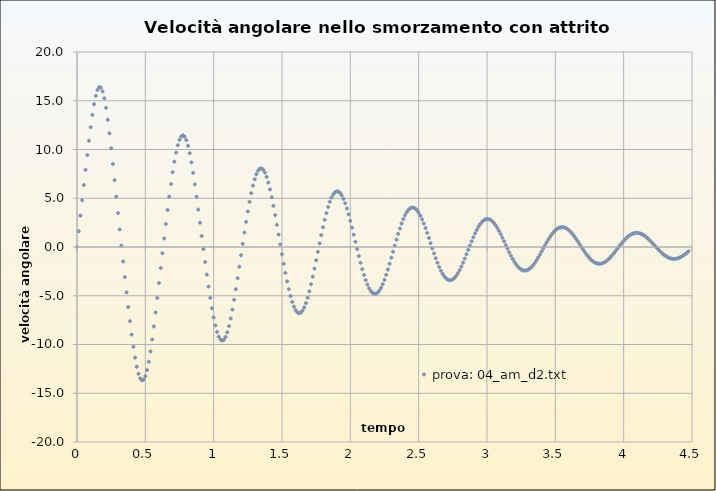
| Category | prova: 04_am_d2.txt |
|---|---|
| 0.0 | 0 |
| 0.012499999999999956 | 1.613 |
| 0.02499999999999991 | 3.207 |
| 0.03749999999999987 | 4.789 |
| 0.04999999999999982 | 6.357 |
| 0.0625 | 7.909 |
| 0.07499999999999996 | 9.43 |
| 0.08749999999999991 | 10.9 |
| 0.09999999999999987 | 12.287 |
| 0.11249999999999982 | 13.55 |
| 0.125 | 14.64 |
| 0.13749999999999996 | 15.508 |
| 0.1499999999999999 | 16.104 |
| 0.16249999999999987 | 16.389 |
| 0.17499999999999982 | 16.341 |
| 0.1875 | 15.957 |
| 0.19999999999999996 | 15.256 |
| 0.2124999999999999 | 14.273 |
| 0.22499999999999987 | 13.056 |
| 0.23749999999999982 | 11.657 |
| 0.25 | 10.127 |
| 0.26249999999999996 | 8.512 |
| 0.2749999999999999 | 6.848 |
| 0.2875000000000001 | 5.163 |
| 0.2999999999999998 | 3.476 |
| 0.3125 | 1.801 |
| 0.32499999999999973 | 0.145 |
| 0.3374999999999999 | -1.485 |
| 0.3500000000000001 | -3.085 |
| 0.3624999999999998 | -4.647 |
| 0.375 | -6.162 |
| 0.38749999999999973 | -7.613 |
| 0.3999999999999999 | -8.979 |
| 0.4125000000000001 | -10.235 |
| 0.4249999999999998 | -11.347 |
| 0.4375 | -12.28 |
| 0.44999999999999973 | -12.999 |
| 0.4624999999999999 | -13.472 |
| 0.4750000000000001 | -13.676 |
| 0.4874999999999998 | -13.598 |
| 0.5 | -13.242 |
| 0.5124999999999997 | -12.622 |
| 0.5249999999999999 | -11.766 |
| 0.5375000000000001 | -10.709 |
| 0.5499999999999998 | -9.489 |
| 0.5625 | -8.145 |
| 0.5749999999999997 | -6.713 |
| 0.5874999999999999 | -5.223 |
| 0.6000000000000001 | -3.701 |
| 0.6124999999999998 | -2.166 |
| 0.625 | -0.637 |
| 0.6374999999999997 | 0.875 |
| 0.6499999999999999 | 2.355 |
| 0.6625000000000001 | 3.792 |
| 0.6749999999999998 | 5.168 |
| 0.6875 | 6.468 |
| 0.6999999999999997 | 7.67 |
| 0.7124999999999999 | 8.751 |
| 0.7250000000000001 | 9.683 |
| 0.7374999999999998 | 10.442 |
| 0.75 | 11.002 |
| 0.7624999999999997 | 11.342 |
| 0.7749999999999999 | 11.451 |
| 0.7875000000000001 | 11.323 |
| 0.7999999999999998 | 10.964 |
| 0.8125 | 10.388 |
| 0.8249999999999997 | 9.617 |
| 0.8374999999999999 | 8.679 |
| 0.8500000000000001 | 7.603 |
| 0.8624999999999998 | 6.419 |
| 0.875 | 5.156 |
| 0.8874999999999997 | 3.84 |
| 0.8999999999999999 | 2.493 |
| 0.9125000000000001 | 1.136 |
| 0.9249999999999998 | -0.214 |
| 0.9375 | -1.541 |
| 0.9499999999999997 | -2.828 |
| 0.9624999999999999 | -4.059 |
| 0.9750000000000001 | -5.215 |
| 0.9874999999999998 | -6.279 |
| 1.0 | -7.229 |
| 1.0124999999999997 | -8.045 |
| 1.025 | -8.707 |
| 1.0375 | -9.197 |
| 1.0499999999999998 | -9.499 |
| 1.0625 | -9.605 |
| 1.0749999999999997 | -9.513 |
| 1.0875 | -9.226 |
| 1.1 | -8.755 |
| 1.1124999999999998 | -8.116 |
| 1.125 | -7.331 |
| 1.1374999999999997 | -6.423 |
| 1.15 | -5.415 |
| 1.1625 | -4.331 |
| 1.1749999999999998 | -3.195 |
| 1.1875 | -2.028 |
| 1.1999999999999997 | -0.848 |
| 1.2125 | 0.327 |
| 1.225 | 1.478 |
| 1.2374999999999998 | 2.589 |
| 1.25 | 3.643 |
| 1.2624999999999997 | 4.624 |
| 1.275 | 5.514 |
| 1.2875 | 6.295 |
| 1.2999999999999998 | 6.951 |
| 1.3125 | 7.466 |
| 1.3249999999999997 | 7.829 |
| 1.3375 | 8.029 |
| 1.35 | 8.062 |
| 1.3624999999999998 | 7.928 |
| 1.375 | 7.634 |
| 1.3874999999999997 | 7.188 |
| 1.4 | 6.605 |
| 1.4125 | 5.903 |
| 1.4249999999999998 | 5.1 |
| 1.4375 | 4.216 |
| 1.4499999999999997 | 3.271 |
| 1.4625 | 2.284 |
| 1.475 | 1.274 |
| 1.4874999999999998 | 0.259 |
| 1.5 | -0.745 |
| 1.5124999999999997 | -1.72 |
| 1.525 | -2.652 |
| 1.5375 | -3.525 |
| 1.5499999999999998 | -4.322 |
| 1.5625 | -5.029 |
| 1.5749999999999997 | -5.633 |
| 1.5875 | -6.119 |
| 1.6 | -6.478 |
| 1.6124999999999998 | -6.702 |
| 1.625 | -6.785 |
| 1.6374999999999997 | -6.728 |
| 1.65 | -6.533 |
| 1.6625 | -6.206 |
| 1.6749999999999998 | -5.759 |
| 1.6875 | -5.204 |
| 1.6999999999999997 | -4.555 |
| 1.7125 | -3.829 |
| 1.725 | -3.043 |
| 1.7374999999999998 | -2.213 |
| 1.75 | -1.356 |
| 1.7624999999999997 | -0.489 |
| 1.775 | 0.374 |
| 1.7875 | 1.217 |
| 1.7999999999999998 | 2.025 |
| 1.8125 | 2.784 |
| 1.8249999999999997 | 3.48 |
| 1.8375 | 4.101 |
| 1.85 | 4.634 |
| 1.8624999999999998 | 5.068 |
| 1.875 | 5.396 |
| 1.8874999999999997 | 5.609 |
| 1.9 | 5.705 |
| 1.9125 | 5.682 |
| 1.9249999999999998 | 5.542 |
| 1.9375 | 5.29 |
| 1.9499999999999997 | 4.934 |
| 1.9625 | 4.484 |
| 1.975 | 3.951 |
| 1.9874999999999998 | 3.349 |
| 2.0 | 2.691 |
| 2.0124999999999997 | 1.993 |
| 2.025 | 1.267 |
| 2.0375 | 0.53 |
| 2.05 | -0.206 |
| 2.0625 | -0.927 |
| 2.0749999999999997 | -1.619 |
| 2.0875 | -2.27 |
| 2.1 | -2.868 |
| 2.1125 | -3.401 |
| 2.125 | -3.861 |
| 2.1374999999999997 | -4.236 |
| 2.15 | -4.521 |
| 2.1625 | -4.71 |
| 2.175 | -4.8 |
| 2.1875 | -4.789 |
| 2.1999999999999997 | -4.68 |
| 2.2125 | -4.476 |
| 2.225 | -4.184 |
| 2.2375 | -3.81 |
| 2.25 | -3.366 |
| 2.2624999999999997 | -2.862 |
| 2.275 | -2.309 |
| 2.2875 | -1.719 |
| 2.3000000000000003 | -1.105 |
| 2.3124999999999996 | -0.48 |
| 2.3249999999999997 | 0.145 |
| 2.3375 | 0.757 |
| 2.35 | 1.345 |
| 2.3625000000000003 | 1.899 |
| 2.3749999999999996 | 2.406 |
| 2.3874999999999997 | 2.859 |
| 2.4 | 3.248 |
| 2.4125 | 3.566 |
| 2.4250000000000003 | 3.807 |
| 2.4374999999999996 | 3.966 |
| 2.4499999999999997 | 4.042 |
| 2.4625 | 4.034 |
| 2.475 | 3.942 |
| 2.4875000000000003 | 3.77 |
| 2.4999999999999996 | 3.524 |
| 2.5124999999999997 | 3.21 |
| 2.525 | 2.835 |
| 2.5375 | 2.409 |
| 2.5500000000000003 | 1.941 |
| 2.5624999999999996 | 1.442 |
| 2.5749999999999997 | 0.923 |
| 2.5875 | 0.393 |
| 2.6 | -0.136 |
| 2.6125000000000003 | -0.654 |
| 2.6249999999999996 | -1.151 |
| 2.6374999999999997 | -1.618 |
| 2.65 | -2.046 |
| 2.6625 | -2.426 |
| 2.6750000000000003 | -2.751 |
| 2.6874999999999996 | -3.016 |
| 2.6999999999999997 | -3.216 |
| 2.7125 | -3.347 |
| 2.725 | -3.406 |
| 2.7375000000000003 | -3.395 |
| 2.7499999999999996 | -3.314 |
| 2.7624999999999997 | -3.166 |
| 2.775 | -2.955 |
| 2.7875 | -2.687 |
| 2.8000000000000003 | -2.368 |
| 2.8124999999999996 | -2.006 |
| 2.8249999999999997 | -1.609 |
| 2.8375 | -1.186 |
| 2.85 | -0.746 |
| 2.8625000000000003 | -0.298 |
| 2.8749999999999996 | 0.149 |
| 2.8874999999999997 | 0.586 |
| 2.9 | 1.004 |
| 2.9125 | 1.396 |
| 2.9250000000000003 | 1.754 |
| 2.9374999999999996 | 2.071 |
| 2.9499999999999997 | 2.342 |
| 2.9625 | 2.56 |
| 2.975 | 2.723 |
| 2.9875000000000003 | 2.827 |
| 2.9999999999999996 | 2.872 |
| 3.0124999999999997 | 2.856 |
| 3.025 | 2.782 |
| 3.0375 | 2.652 |
| 3.0500000000000003 | 2.469 |
| 3.0624999999999996 | 2.239 |
| 3.0749999999999997 | 1.966 |
| 3.0875 | 1.657 |
| 3.1 | 1.32 |
| 3.1125000000000003 | 0.961 |
| 3.1249999999999996 | 0.588 |
| 3.1374999999999997 | 0.209 |
| 3.15 | -0.168 |
| 3.1625 | -0.536 |
| 3.1750000000000003 | -0.887 |
| 3.1874999999999996 | -1.215 |
| 3.1999999999999997 | -1.513 |
| 3.2125 | -1.776 |
| 3.225 | -1.999 |
| 3.2375000000000003 | -2.177 |
| 3.2499999999999996 | -2.308 |
| 3.2624999999999997 | -2.39 |
| 3.275 | -2.421 |
| 3.2875 | -2.402 |
| 3.3000000000000003 | -2.333 |
| 3.3124999999999996 | -2.217 |
| 3.3249999999999997 | -2.058 |
| 3.3375 | -1.859 |
| 3.35 | -1.624 |
| 3.3625000000000003 | -1.36 |
| 3.3749999999999996 | -1.073 |
| 3.3874999999999997 | -0.768 |
| 3.4 | -0.452 |
| 3.4125 | -0.133 |
| 3.4250000000000003 | 0.185 |
| 3.4374999999999996 | 0.494 |
| 3.4499999999999997 | 0.788 |
| 3.4625 | 1.062 |
| 3.475 | 1.309 |
| 3.4875000000000003 | 1.526 |
| 3.4999999999999996 | 1.709 |
| 3.5124999999999997 | 1.854 |
| 3.525 | 1.958 |
| 3.5375 | 2.02 |
| 3.5500000000000003 | 2.04 |
| 3.5624999999999996 | 2.018 |
| 3.5749999999999997 | 1.954 |
| 3.5875 | 1.851 |
| 3.6 | 1.711 |
| 3.6125000000000003 | 1.538 |
| 3.6249999999999996 | 1.337 |
| 3.6374999999999997 | 1.111 |
| 3.65 | 0.866 |
| 3.6625 | 0.607 |
| 3.6750000000000003 | 0.34 |
| 3.6874999999999996 | 0.07 |
| 3.6999999999999997 | -0.197 |
| 3.7125 | -0.456 |
| 3.725 | -0.702 |
| 3.7375000000000003 | -0.93 |
| 3.7499999999999996 | -1.135 |
| 3.7624999999999997 | -1.313 |
| 3.775 | -1.462 |
| 3.7875 | -1.579 |
| 3.8000000000000003 | -1.661 |
| 3.8124999999999996 | -1.708 |
| 3.8249999999999997 | -1.719 |
| 3.8375 | -1.694 |
| 3.85 | -1.635 |
| 3.8625000000000003 | -1.542 |
| 3.8749999999999996 | -1.42 |
| 3.8874999999999997 | -1.27 |
| 3.9 | -1.097 |
| 3.9125 | -0.903 |
| 3.9250000000000003 | -0.694 |
| 3.9374999999999996 | -0.474 |
| 3.9499999999999997 | -0.248 |
| 3.9625 | -0.021 |
| 3.975 | 0.204 |
| 3.9875000000000003 | 0.421 |
| 3.9999999999999996 | 0.626 |
| 4.012499999999999 | 0.815 |
| 4.025 | 0.984 |
| 4.0375 | 1.131 |
| 4.050000000000001 | 1.251 |
| 4.0625 | 1.345 |
| 4.074999999999999 | 1.409 |
| 4.0875 | 1.443 |
| 4.1 | 1.447 |
| 4.112500000000001 | 1.421 |
| 4.125 | 1.366 |
| 4.137499999999999 | 1.284 |
| 4.15 | 1.176 |
| 4.1625 | 1.046 |
| 4.175000000000001 | 0.897 |
| 4.1875 | 0.731 |
| 4.199999999999999 | 0.553 |
| 4.2125 | 0.366 |
| 4.225 | 0.175 |
| 4.237500000000001 | -0.017 |
| 4.25 | -0.205 |
| 4.262499999999999 | -0.386 |
| 4.275 | -0.557 |
| 4.2875 | -0.714 |
| 4.300000000000001 | -0.853 |
| 4.3125 | -0.973 |
| 4.324999999999999 | -1.071 |
| 4.3375 | -1.145 |
| 4.35 | -1.195 |
| 4.362500000000001 | -1.219 |
| 4.375 | -1.217 |
| 4.387499999999999 | -1.191 |
| 4.4 | -1.14 |
| 4.4125 | -1.067 |
| 4.425000000000001 | -0.973 |
| 4.4375 | -0.86 |
| 4.449999999999999 | -0.731 |
| 4.4625 | -0.59 |
| 4.475 | -0.438 |